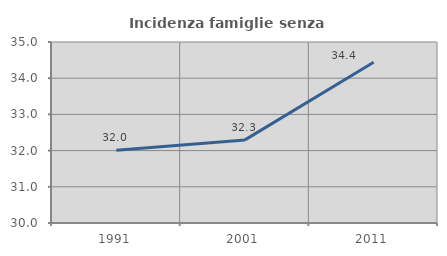
| Category | Incidenza famiglie senza nuclei |
|---|---|
| 1991.0 | 32.011 |
| 2001.0 | 32.295 |
| 2011.0 | 34.439 |